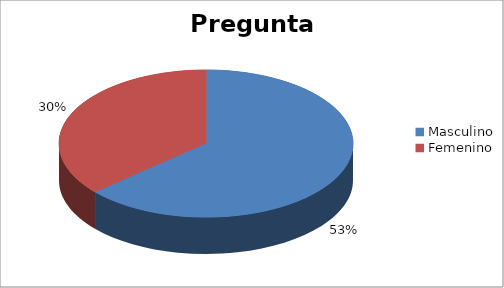
| Category | Series 0 |
|---|---|
| Masculino | 0.528 |
| Femenino | 0.302 |